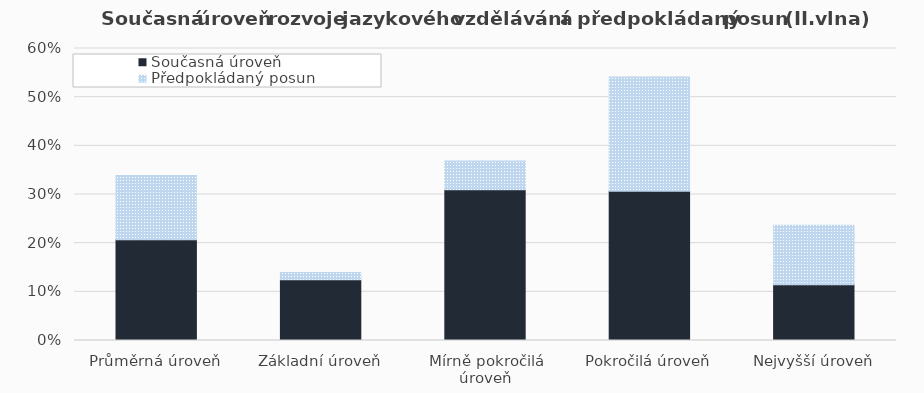
| Category | Současná úroveň | Předpokládaný posun |
|---|---|---|
| Průměrná úroveň | 0.207 | 0.132 |
| Základní úroveň | 0.125 | 0.015 |
| Mírně pokročilá úroveň | 0.31 | 0.06 |
| Pokročilá úroveň | 0.307 | 0.235 |
| Nejvyšší úroveň | 0.115 | 0.122 |